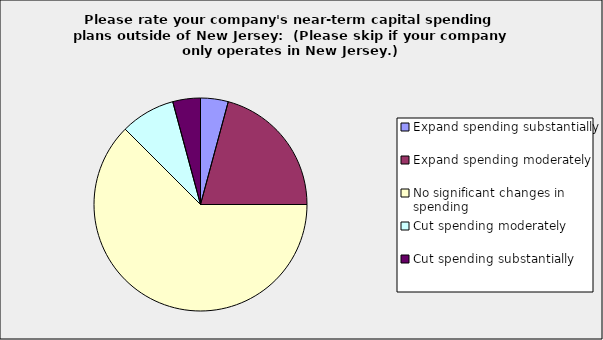
| Category | Series 0 |
|---|---|
| Expand spending substantially | 0.042 |
| Expand spending moderately | 0.208 |
| No significant changes in spending | 0.625 |
| Cut spending moderately | 0.083 |
| Cut spending substantially | 0.042 |